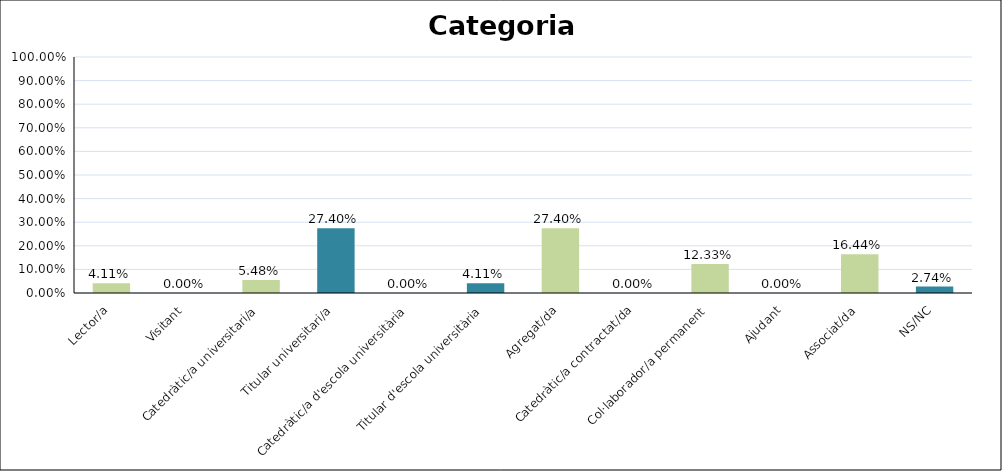
| Category | Series 0 |
|---|---|
| Lector/a | 0.041 |
| Visitant | 0 |
| Catedràtic/a universitari/a | 0.055 |
| Titular universitari/a | 0.274 |
| Catedràtic/a d'escola universitària | 0 |
| Titular d'escola universitària | 0.041 |
| Agregat/da | 0.274 |
| Catedràtic/a contractat/da | 0 |
| Col·laborador/a permanent | 0.123 |
| Ajudant | 0 |
| Associat/da | 0.164 |
| NS/NC | 0.027 |